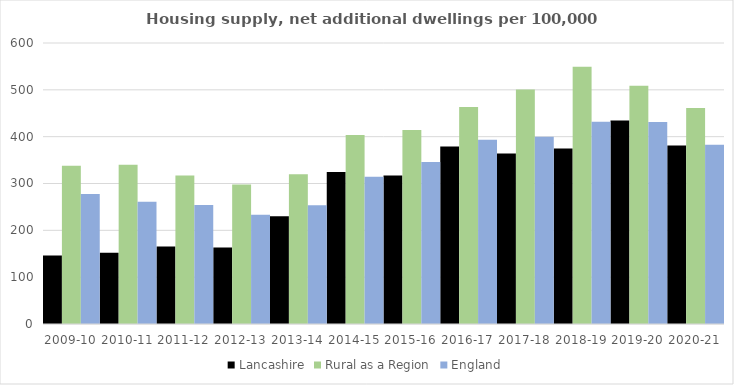
| Category | Lancashire | Rural as a Region | England |
|---|---|---|---|
| 2009-10 | 146.247 | 337.852 | 277.548 |
| 2010-11 | 152.059 | 340.105 | 260.994 |
| 2011-12 | 165.421 | 317.04 | 254.007 |
| 2012-13 | 163.523 | 297.763 | 233.153 |
| 2013-14 | 230.105 | 319.835 | 253.602 |
| 2014-15 | 324.453 | 403.796 | 314.256 |
| 2015-16 | 317.275 | 414.091 | 346.154 |
| 2016-17 | 378.947 | 463.209 | 393.256 |
| 2017-18 | 363.937 | 500.68 | 399.646 |
| 2018-19 | 374.942 | 549.491 | 432.099 |
| 2019-20 | 434.416 | 508.493 | 431.187 |
| 2020-21 | 380.906 | 461.114 | 382.827 |